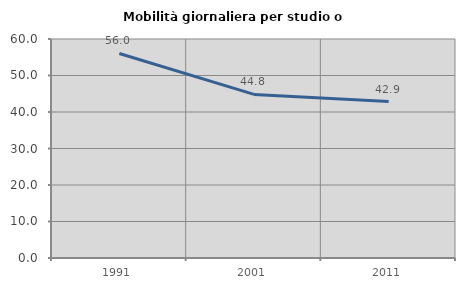
| Category | Mobilità giornaliera per studio o lavoro |
|---|---|
| 1991.0 | 56.034 |
| 2001.0 | 44.828 |
| 2011.0 | 42.857 |